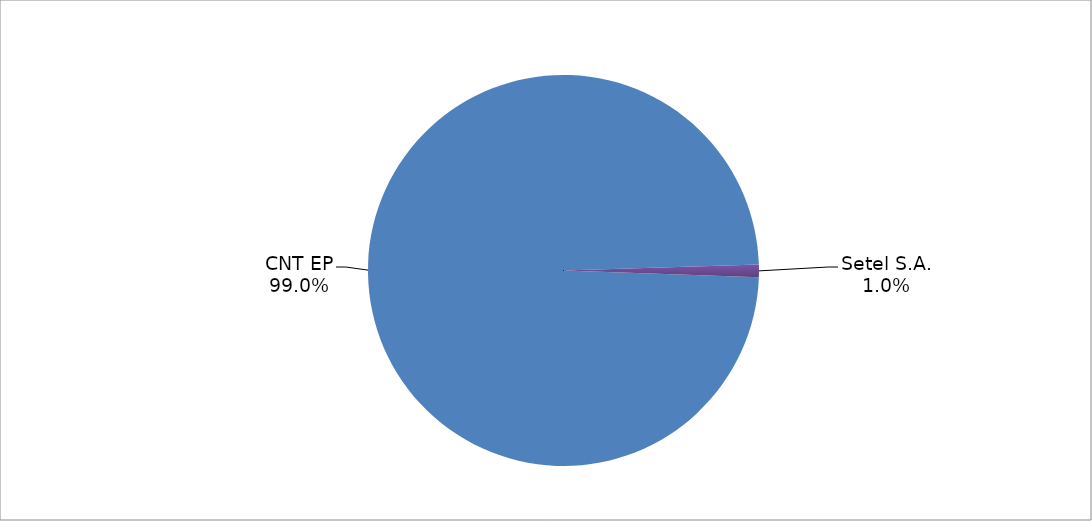
| Category | Series 0 |
|---|---|
| CNT EP | 283 |
| Setel S.A. | 3 |